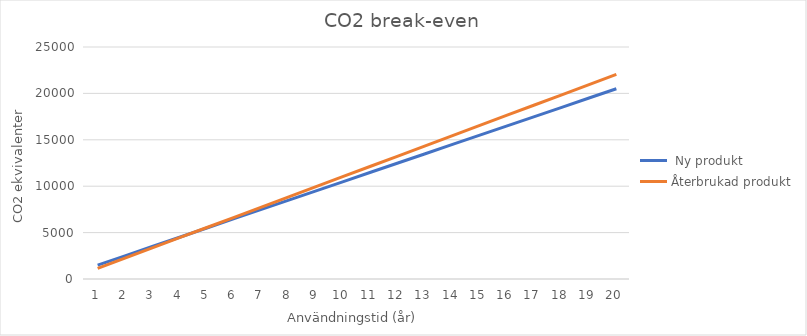
| Category |  Ny produkt | Återbrukad produkt |
|---|---|---|
| 0 | 1500 | 1150 |
| 1 | 2500 | 2250 |
| 2 | 3500 | 3350 |
| 3 | 4500 | 4450 |
| 4 | 5500 | 5550 |
| 5 | 6500 | 6650 |
| 6 | 7500 | 7750 |
| 7 | 8500 | 8850 |
| 8 | 9500 | 9950 |
| 9 | 10500 | 11050 |
| 10 | 11500 | 12150 |
| 11 | 12500 | 13250 |
| 12 | 13500 | 14350 |
| 13 | 14500 | 15450 |
| 14 | 15500 | 16550 |
| 15 | 16500 | 17650 |
| 16 | 17500 | 18750 |
| 17 | 18500 | 19850 |
| 18 | 19500 | 20950 |
| 19 | 20500 | 22050 |